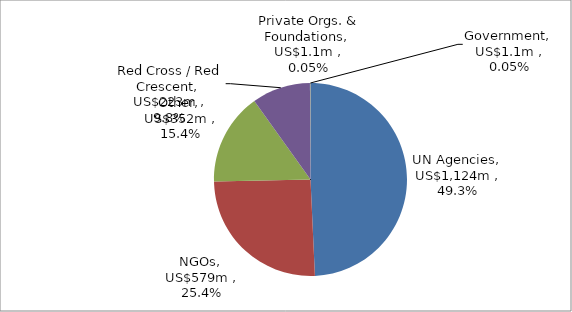
| Category | US$ millions |
|---|---|
| UN Agencies | 1123.808 |
| NGOs | 579.141 |
| Other | 352.382 |
| Red Cross / Red Crescent | 223.486 |
| Private Orgs. & Foundations | 1.096 |
| Government | 1.055 |